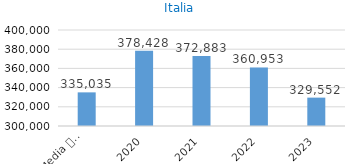
| Category | Series 0 |
|---|---|
| Media 
(2015-2019) | 335034.6 |
| 2020 | 378428 |
| 2021 | 372883 |
| 2022 | 360953 |
| 2023 | 329552.16 |